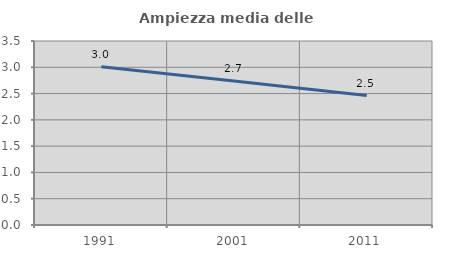
| Category | Ampiezza media delle famiglie |
|---|---|
| 1991.0 | 3.011 |
| 2001.0 | 2.739 |
| 2011.0 | 2.463 |